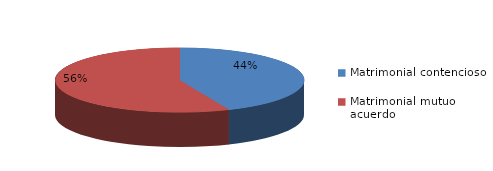
| Category | Series 0 |
|---|---|
| 0 | 148 |
| 1 | 192 |